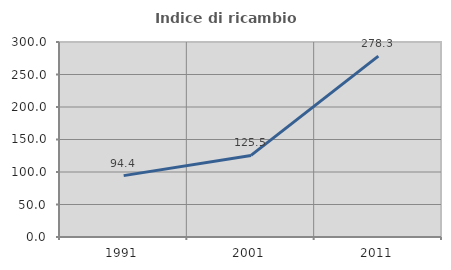
| Category | Indice di ricambio occupazionale  |
|---|---|
| 1991.0 | 94.444 |
| 2001.0 | 125.481 |
| 2011.0 | 278.287 |